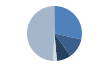
| Category | Series 0 |
|---|---|
| ARRASTRE | 417 |
| CERCO | 171 |
| PALANGRE | 123 |
| REDES DE ENMALLE | 34 |
| ARTES MENORES | 713 |
| SIN TIPO ASIGNADO | 5 |